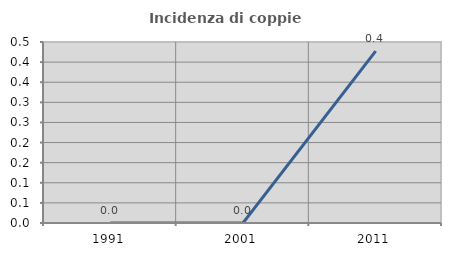
| Category | Incidenza di coppie miste |
|---|---|
| 1991.0 | 0 |
| 2001.0 | 0 |
| 2011.0 | 0.427 |